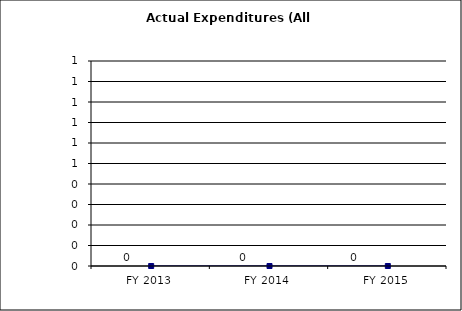
| Category | Actual Expenditures (All Funds) |
|---|---|
| FY 2013 | 0 |
| FY 2014 | 0 |
| FY 2015 | 0 |